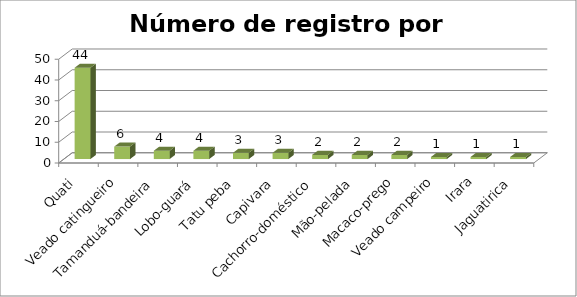
| Category | Series 0 |
|---|---|
| Quati | 44 |
| Veado catingueiro | 6 |
| Tamanduá-bandeira | 4 |
| Lobo-guará | 4 |
| Tatu peba | 3 |
| Capivara | 3 |
| Cachorro-doméstico | 2 |
| Mão-pelada | 2 |
| Macaco-prego | 2 |
| Veado campeiro | 1 |
| Irara | 1 |
| Jaguatirica | 1 |